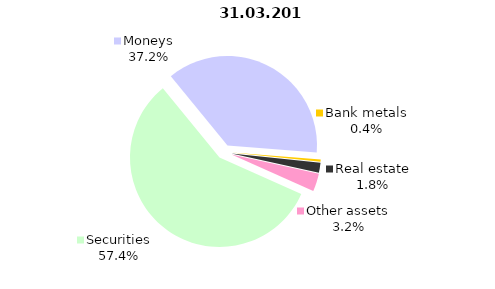
| Category | 31.03.2018 |
|---|---|
| Securities | 1427 |
| Moneys | 923.9 |
| Bank metals | 9.7 |
| Real estate | 45.1 |
| Other assets | 79.5 |